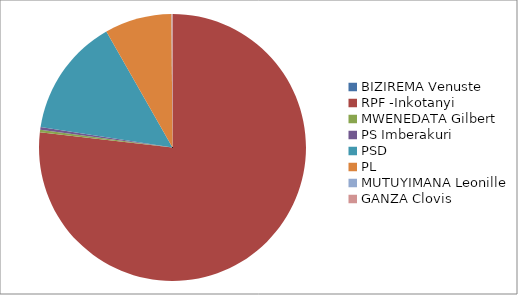
| Category | Series 0 |
|---|---|
| BIZIREMA Venuste | 204 |
| RPF -Inkotanyi | 1082879 |
| MWENEDATA Gilbert | 4242 |
| PS Imberakuri | 4671 |
| PSD | 201512 |
| PL | 114491 |
| MUTUYIMANA Leonille | 433 |
| GANZA Clovis | 1374 |